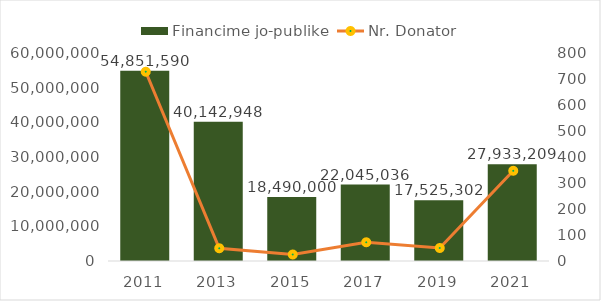
| Category | Financime jo-publike |
|---|---|
| 2011.0 | 54851590 |
| 2013.0 | 40142948 |
| 2015.0 | 18490000 |
| 2017.0 | 22045036 |
| 2019.0 | 17525302 |
| 2021.0 | 27933208.895 |